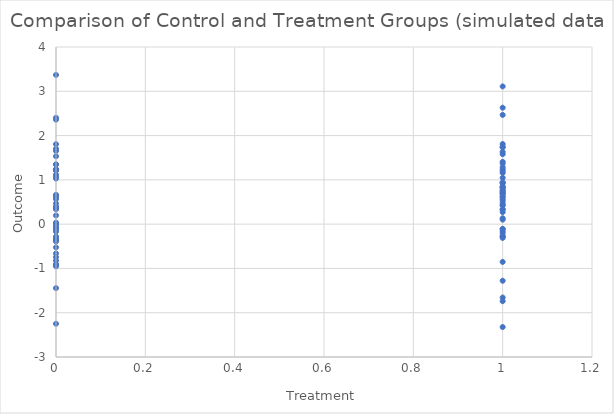
| Category | Y |
|---|---|
| 0.0 | 0.636 |
| 1.0 | 0.829 |
| 1.0 | 0.337 |
| 0.0 | -0.662 |
| 0.0 | 3.369 |
| 0.0 | 1.35 |
| 1.0 | 1.046 |
| 1.0 | 0.638 |
| 0.0 | -0.356 |
| 1.0 | 0.689 |
| 1.0 | -0.278 |
| 1.0 | 1.368 |
| 0.0 | -2.249 |
| 0.0 | -0.905 |
| 1.0 | 2.629 |
| 1.0 | -0.107 |
| 1.0 | 0.798 |
| 1.0 | -1.657 |
| 1.0 | -0.111 |
| 0.0 | -0.524 |
| 0.0 | 1.806 |
| 0.0 | 0.366 |
| 0.0 | -0.827 |
| 1.0 | 0.481 |
| 0.0 | 1.219 |
| 0.0 | -1.444 |
| 0.0 | 1.702 |
| 0.0 | 0.007 |
| 0.0 | -0.391 |
| 0.0 | -0.951 |
| 1.0 | 0.751 |
| 1.0 | 1.157 |
| 0.0 | -0.125 |
| 1.0 | 1.745 |
| 1.0 | 1.407 |
| 0.0 | -0.034 |
| 0.0 | 0.662 |
| 1.0 | -2.323 |
| 1.0 | 0.58 |
| 1.0 | 0.751 |
| 0.0 | 1.03 |
| 0.0 | 1.074 |
| 0.0 | 1.345 |
| 0.0 | 1.238 |
| 1.0 | 2.467 |
| 0.0 | -0.169 |
| 0.0 | -0.09 |
| 1.0 | 0.421 |
| 1.0 | 0.434 |
| 0.0 | 2.36 |
| 1.0 | 1.809 |
| 0.0 | -0.349 |
| 0.0 | 0.62 |
| 1.0 | 1.197 |
| 0.0 | 0.567 |
| 0.0 | -0.28 |
| 0.0 | 1.654 |
| 1.0 | 1.579 |
| 1.0 | 0.835 |
| 0.0 | 0.4 |
| 1.0 | 0.102 |
| 0.0 | 0.469 |
| 0.0 | 1.533 |
| 0.0 | -0.307 |
| 1.0 | -0.208 |
| 1.0 | 0.617 |
| 1.0 | -1.278 |
| 1.0 | 0.696 |
| 0.0 | 1.238 |
| 1.0 | 0.923 |
| 0.0 | 0.368 |
| 0.0 | 1.117 |
| 0.0 | -0.356 |
| 1.0 | -0.311 |
| 1.0 | 1.241 |
| 1.0 | 1.732 |
| 0.0 | 0.012 |
| 0.0 | 2.401 |
| 1.0 | -0.274 |
| 1.0 | 0.539 |
| 0.0 | -0.922 |
| 1.0 | 0.327 |
| 0.0 | 1.207 |
| 1.0 | -0.16 |
| 0.0 | -0.072 |
| 1.0 | 0.133 |
| 0.0 | 0.035 |
| 1.0 | 0.938 |
| 0.0 | 0.337 |
| 1.0 | 1.286 |
| 1.0 | 3.11 |
| 0.0 | -0.744 |
| 1.0 | -1.739 |
| 1.0 | 0.943 |
| 1.0 | 0.271 |
| 0.0 | 0.196 |
| 1.0 | 0.848 |
| 1.0 | -0.852 |
| 1.0 | 0.709 |
| 1.0 | 1.63 |